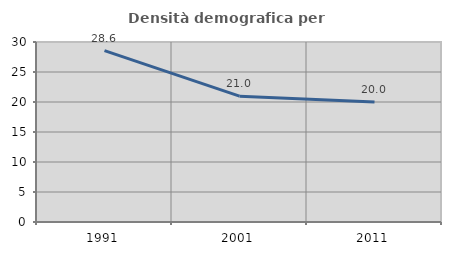
| Category | Densità demografica |
|---|---|
| 1991.0 | 28.554 |
| 2001.0 | 20.972 |
| 2011.0 | 20.004 |